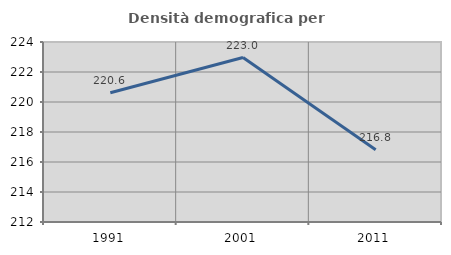
| Category | Densità demografica |
|---|---|
| 1991.0 | 220.621 |
| 2001.0 | 222.966 |
| 2011.0 | 216.819 |